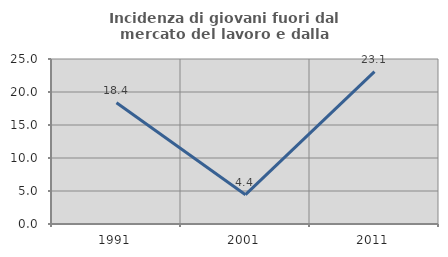
| Category | Incidenza di giovani fuori dal mercato del lavoro e dalla formazione  |
|---|---|
| 1991.0 | 18.367 |
| 2001.0 | 4.444 |
| 2011.0 | 23.077 |